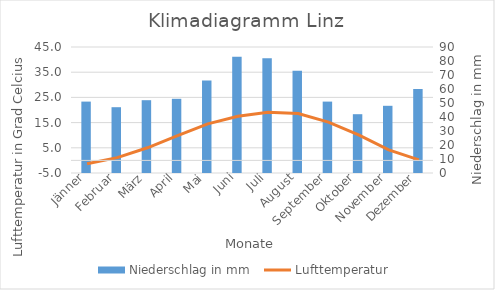
| Category | Niederschlag in mm |
|---|---|
| Jänner | 51 |
| Februar | 47 |
| März | 52 |
| April | 53 |
| Mai | 66 |
| Juni | 83 |
| Juli | 82 |
| August | 73 |
| September | 51 |
| Oktober | 42 |
| November | 48 |
| Dezember | 60 |